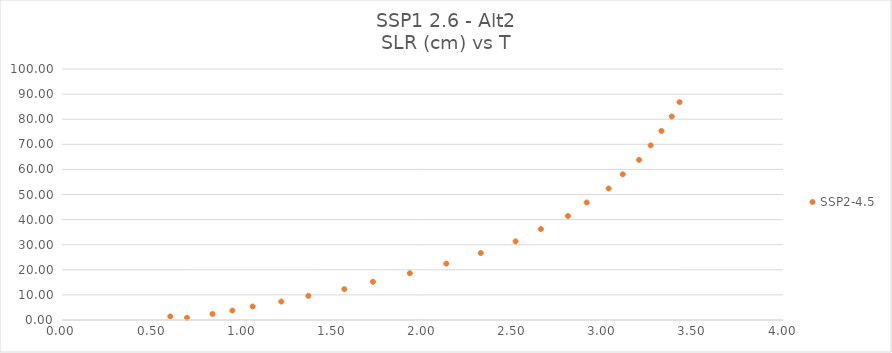
| Category | SSP2-4.5 |
|---|---|
| 0.693400617 | 0.87 |
| 0.600872844 | 1.399 |
| 0.835003234 | 2.407 |
| 0.945258389 | 3.755 |
| 1.057970477 | 5.386 |
| 1.216609042 | 7.344 |
| 1.366998793 | 9.606 |
| 1.566434093 | 12.264 |
| 1.725120317 | 15.242 |
| 1.930044464 | 18.639 |
| 2.131932338 | 22.459 |
| 2.323443638 | 26.683 |
| 2.516385038 | 31.319 |
| 2.657001705 | 36.232 |
| 2.807087579 | 41.44 |
| 2.911017111 | 46.811 |
| 3.032926146 | 52.385 |
| 3.111090619 | 58.034 |
| 3.201527344 | 63.783 |
| 3.265869987 | 69.552 |
| 3.325631587 | 75.323 |
| 3.383018307 | 81.084 |
| 3.426247742 | 86.794 |